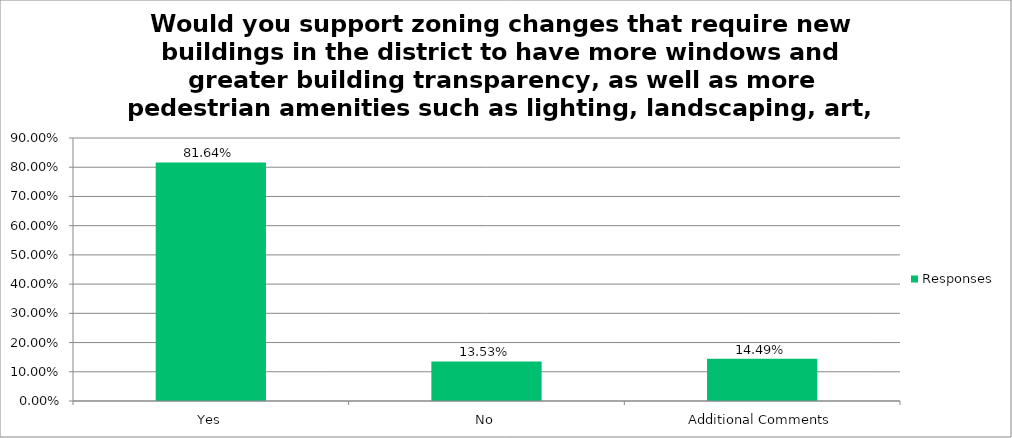
| Category | Responses |
|---|---|
| Yes | 0.816 |
| No | 0.135 |
| Additional Comments | 0.145 |